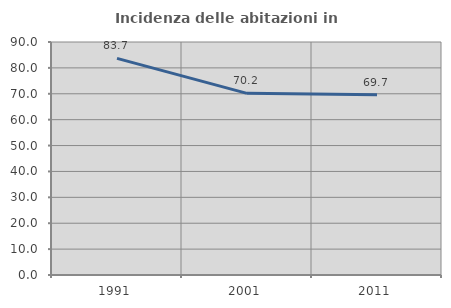
| Category | Incidenza delle abitazioni in proprietà  |
|---|---|
| 1991.0 | 83.673 |
| 2001.0 | 70.168 |
| 2011.0 | 69.663 |